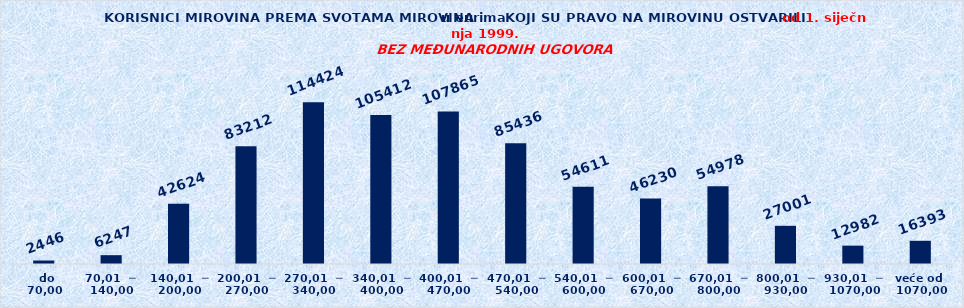
| Category | Series 0 |
|---|---|
|   do  70,00 | 2446 |
| 70,01  ─  140,00 | 6247 |
| 140,01  ─  200,00 | 42624 |
| 200,01  ─  270,00 | 83212 |
| 270,01  ─  340,00 | 114424 |
| 340,01  ─  400,00 | 105412 |
| 400,01  ─  470,00 | 107865 |
| 470,01  ─  540,00 | 85436 |
| 540,01  ─  600,00 | 54611 |
| 600,01  ─  670,00 | 46230 |
| 670,01  ─  800,00 | 54978 |
| 800,01  ─  930,00 | 27001 |
| 930,01  ─  1070,00 | 12982 |
| veće od  1070,00 | 16393 |